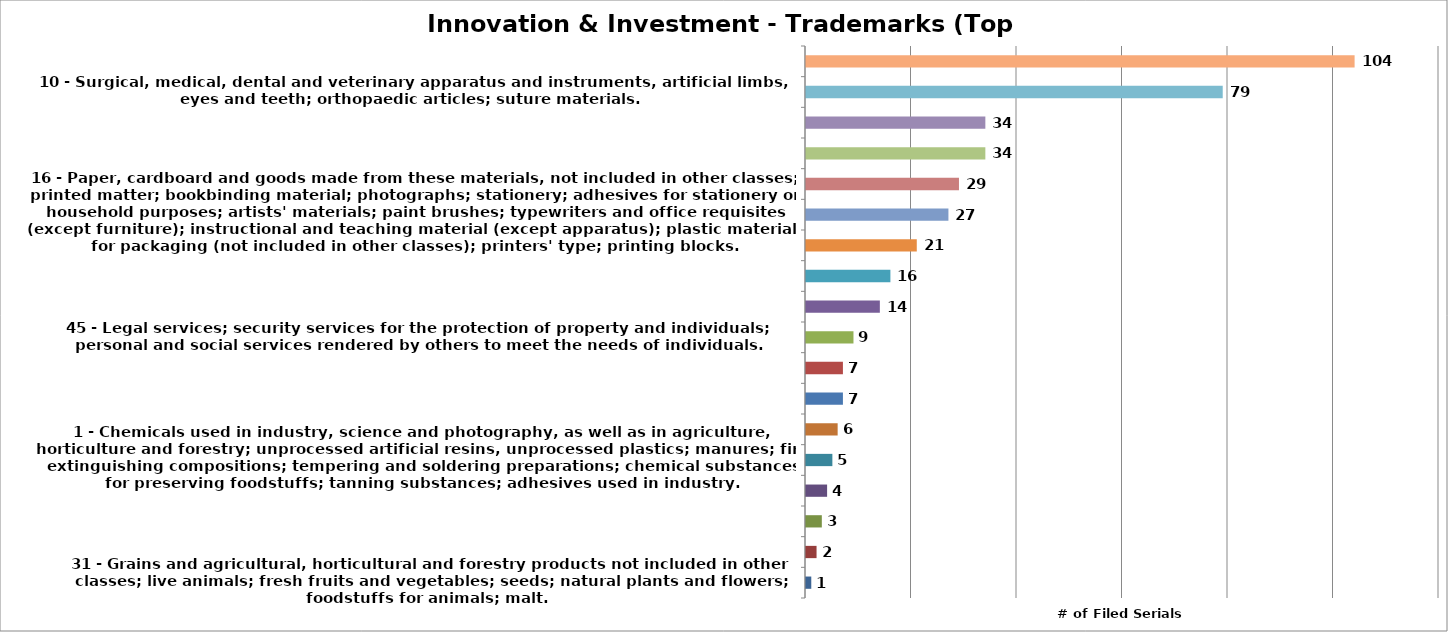
| Category | Series 0 |
|---|---|
| 31 - Grains and agricultural, horticultural and forestry products not included in other classes; live animals; fresh fruits and vegetables; seeds; natural plants and flowers; foodstuffs for animals; malt. | 1 |
| 36 - Insurance; financial affairs; monetary affairs; real estate affairs. | 2 |
| 40 - Treatment of materials.
 | 3 |
| 37 - Building construction; repair; installation services. | 4 |
| 1 - Chemicals used in industry, science and photography, as well as in agriculture, horticulture and forestry; unprocessed artificial resins, unprocessed plastics; manures; fire extinguishing compositions; tempering and soldering preparations; chemical su | 5 |
| 32 - Beers; mineral and aerated waters and other non-alcoholic beverages; fruit beverages and fruit juices; syrups and other preparations for making beverages. | 6 |
| 30 - Coffee, tea, cocoa and artificial coffee; rice; tapioca and sago; flour and preparations made from cereals; bread, pastry and confectionery; ices; sugar, honey, treacle; yeast, baking-powder; salt; mustard; vinegar, sauces (condiments); spices; ice. | 7 |
| 17 - Rubber, gutta-percha, gum, asbestos, mica and goods made from these materials and not included in other classes; plastics in extruded form for use in manufacture; packing, stopping and insulating materials; flexible pipes, not of metal. | 7 |
| 45 - Legal services; security services for the protection of property and individuals; personal and social services rendered by others to meet the needs of individuals. | 9 |
| 41 - Education; providing of training; entertainment; sporting and cultural activities. | 14 |
| 9 - Scientific, nautical, surveying, photographic, cinematographic, optical, weighing, measuring, signalling, checking (supervision), life-saving and teaching apparatus and instruments; apparatus and instruments for conducting, switching, transforming, ac | 16 |
| 35 - Advertising; business management; business administration; office functions. | 21 |
| 16 - Paper, cardboard and goods made from these materials, not included in other classes; printed matter; bookbinding material; photographs; stationery; adhesives for stationery or household purposes; artists' materials; paint brushes; typewriters and off | 27 |
| 42 - Scientific and technological services and research and design relating thereto; industrial analysis and research services; design and development of computer hardware and software. | 29 |
| 29 - Meat, fish, poultry and game; meat extracts; preserved, frozen, dried and cooked fruits and vegetables; jellies, jams, compotes; eggs; milk and milk products; edible oils and fats. | 34 |
| 44 - Medical services; veterinary services; hygienic and beauty care for human beings or animals; agriculture, horticulture and forestry services. | 34 |
| 10 - Surgical, medical, dental and veterinary apparatus and instruments, artificial limbs, eyes and teeth; orthopaedic articles; suture materials. | 79 |
| 5 - Pharmaceutical and veterinary preparations; sanitary preparations for medical purposes; dietetic food and substances adapted for medical or veterinary use, food for babies; dietary supplements for humans and animals; plasters, materials for dressings; | 104 |